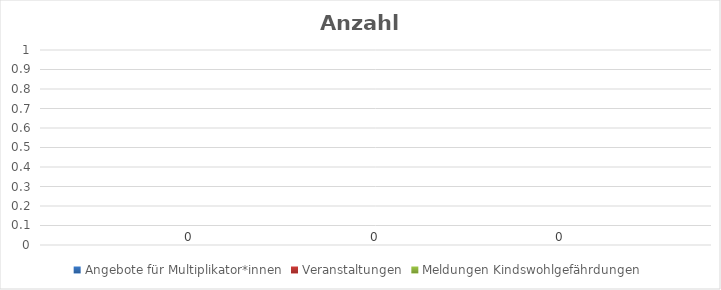
| Category | Angebote für Multiplikator*innen | Veranstaltungen | Meldungen Kindswohlgefährdungen  |
|---|---|---|---|
| 0 | 0 | 0 | 0 |